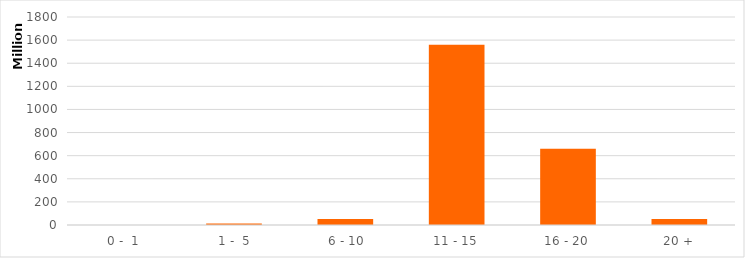
| Category | Series 0 |
|---|---|
|  0 -  1 | 440720.7 |
|  1 -  5 | 11982541 |
|  6 - 10 | 51336609.62 |
| 11 - 15 | 1558875511.8 |
| 16 - 20 | 658970755.33 |
| 20 + | 52198745.84 |